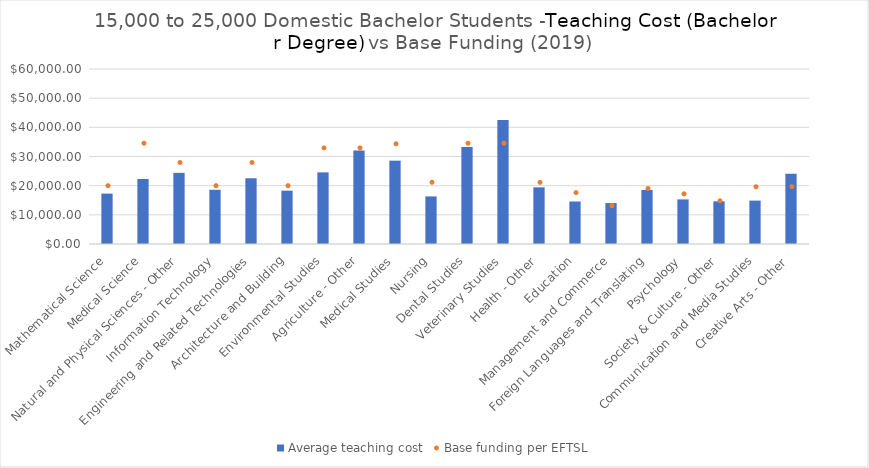
| Category | Average teaching cost |
|---|---|
| Mathematical Science | 17280.076 |
| Medical Science | 22282.718 |
| Natural and Physical Sciences - Other | 24393.66 |
| Information Technology | 18580.051 |
| Engineering and Related Technologies | 22533.884 |
| Architecture and Building | 18292.956 |
| Environmental Studies | 24562.126 |
| Agriculture - Other | 32055.13 |
| Medical Studies | 28572.983 |
| Nursing | 16313.658 |
| Dental Studies | 33296.744 |
| Veterinary Studies | 42498.72 |
| Health - Other | 19423.875 |
| Education | 14570.147 |
| Management and Commerce | 14029.696 |
| Foreign Languages and Translating | 18540.21 |
| Psychology | 15289.956 |
| Society & Culture - Other | 14632.1 |
| Communication and Media Studies | 14874.462 |
| Creative Arts - Other | 24074.092 |